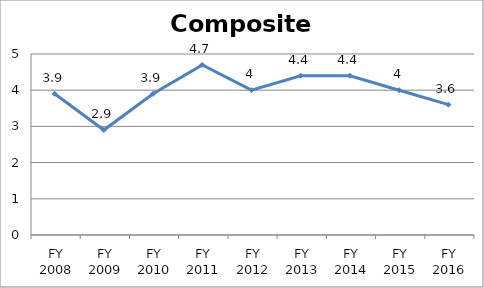
| Category | Composite score |
|---|---|
| FY 2016 | 3.6 |
| FY 2015 | 4 |
| FY 2014 | 4.4 |
| FY 2013 | 4.4 |
| FY 2012 | 4 |
| FY 2011 | 4.7 |
| FY 2010 | 3.9 |
| FY 2009 | 2.9 |
| FY 2008 | 3.9 |